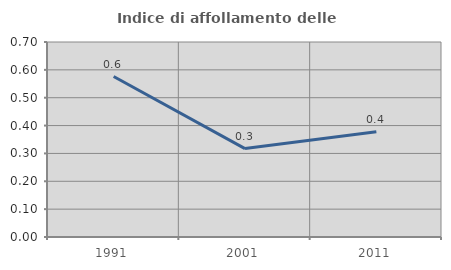
| Category | Indice di affollamento delle abitazioni  |
|---|---|
| 1991.0 | 0.576 |
| 2001.0 | 0.317 |
| 2011.0 | 0.378 |